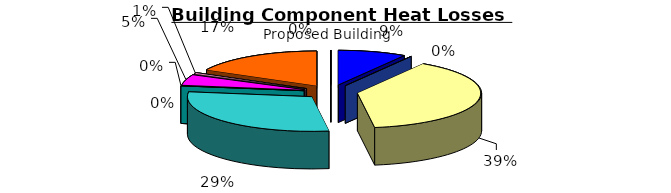
| Category | Series 0 |
|---|---|
| 0 | 0 |
| 1 | 2032.03 |
| 2 | 0 |
| 3 | 8874.88 |
| 4 | 6726.132 |
| 5 | 0 |
| 6 | 0 |
| 7 | 1106.37 |
| 8 | 118.717 |
| 9 | 3969.008 |